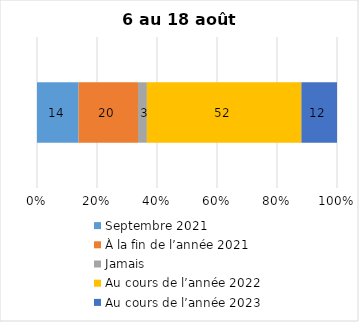
| Category | Septembre 2021 | À la fin de l’année 2021 | Jamais | Au cours de l’année 2022 | Au cours de l’année 2023 |
|---|---|---|---|---|---|
| 0 | 14 | 20 | 3 | 52 | 12 |